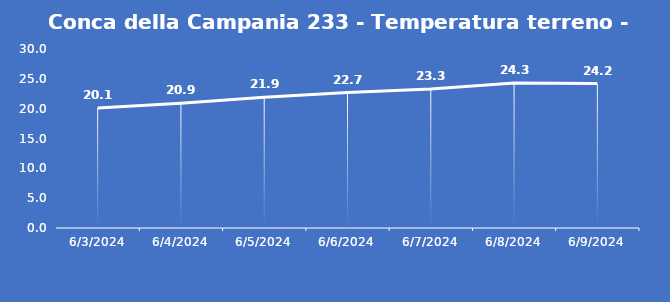
| Category | Conca della Campania 233 - Temperatura terreno - Grezzo (°C) |
|---|---|
| 6/3/24 | 20.1 |
| 6/4/24 | 20.9 |
| 6/5/24 | 21.9 |
| 6/6/24 | 22.7 |
| 6/7/24 | 23.3 |
| 6/8/24 | 24.3 |
| 6/9/24 | 24.2 |